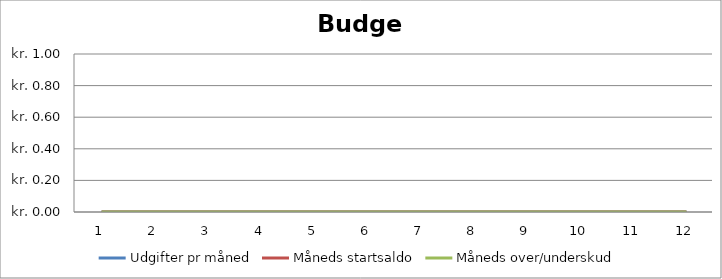
| Category | Udgifter pr måned | Måneds startsaldo | Måneds over/underskud |
|---|---|---|---|
| 0 | 0 | 0 | 0 |
| 1 | 0 | 0 | 0 |
| 2 | 0 | 0 | 0 |
| 3 | 0 | 0 | 0 |
| 4 | 0 | 0 | 0 |
| 5 | 0 | 0 | 0 |
| 6 | 0 | 0 | 0 |
| 7 | 0 | 0 | 0 |
| 8 | 0 | 0 | 0 |
| 9 | 0 | 0 | 0 |
| 10 | 0 | 0 | 0 |
| 11 | 0 | 0 | 0 |